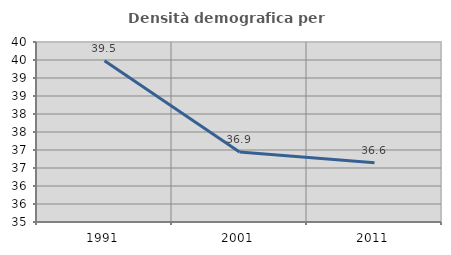
| Category | Densità demografica |
|---|---|
| 1991.0 | 39.476 |
| 2001.0 | 36.947 |
| 2011.0 | 36.647 |